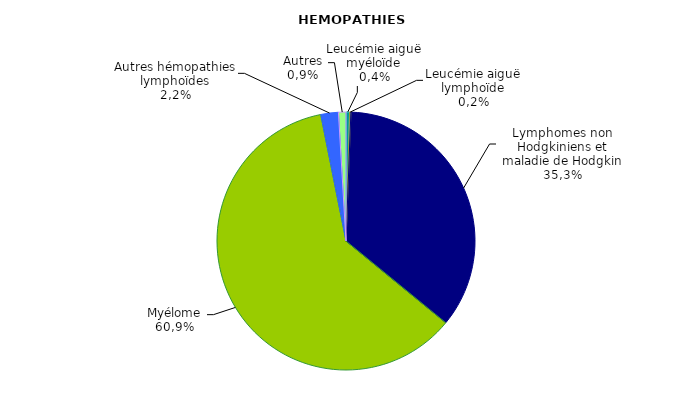
| Category | Nombre | Pourcentage |
|---|---|---|
| Leucémie aiguë myéloïde | 8 | 0.004 |
| Leucémie aiguë lymphoïde | 3 | 0.002 |
| Lymphomes non Hodgkiniens et maladie de Hodgkin | 641 | 0.353 |
| Myélome | 1106 | 0.609 |
| Autres hémopathies lymphoïdes | 40 | 0.022 |
| Autres | 17 | 0.009 |